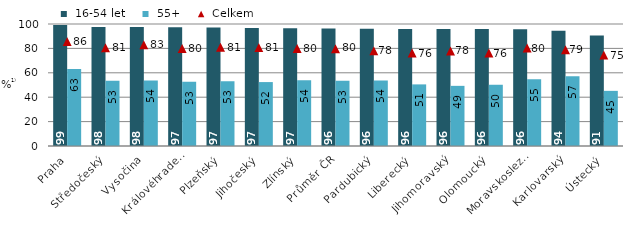
| Category |  16-54 let |  55+ |
|---|---|---|
| Praha | 99.1 | 63.2 |
| Středočeský | 97.5 | 53.4 |
| Vysočina | 97.5 | 53.7 |
| Královéhradecký | 97.4 | 52.7 |
| Plzeňský | 97.1 | 53 |
| Jihočeský | 96.8 | 52.4 |
| Zlínský | 96.5 | 53.8 |
| Průměr ČR | 96.4 | 53.4 |
| Pardubický | 96.2 | 53.7 |
| Liberecký | 95.9 | 50.5 |
| Jihomoravský | 95.9 | 49.3 |
| Olomoucký | 95.9 | 50.2 |
| Moravskoslezský | 95.6 | 54.7 |
| Karlovarský | 94.4 | 57.2 |
| Ústecký | 90.5 | 45.2 |